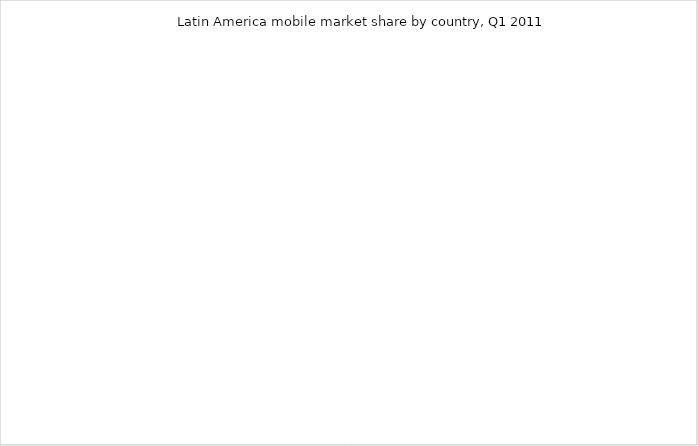
| Category | Series 0 |
|---|---|
| Argentina | 0 |
| Bolivia | 0 |
| Brazil | 0 |
| Chile | 0 |
| Colombia | 0 |
| Ecuador | 0 |
| Paraguay | 0 |
| Peru | 0 |
| Uruguay | 0 |
| Venezuela | 0 |
| Mexico | 0 |